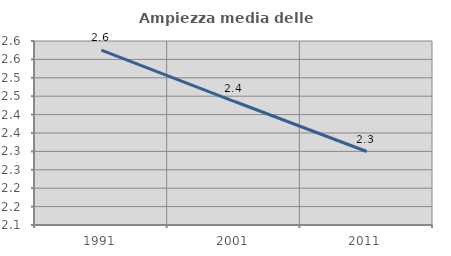
| Category | Ampiezza media delle famiglie |
|---|---|
| 1991.0 | 2.575 |
| 2001.0 | 2.436 |
| 2011.0 | 2.3 |